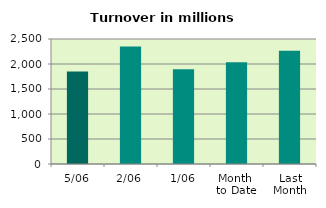
| Category | Series 0 |
|---|---|
| 5/06 | 1852.441 |
| 2/06 | 2350.115 |
| 1/06 | 1897.391 |
| Month 
to Date | 2033.315 |
| Last
Month | 2265.206 |